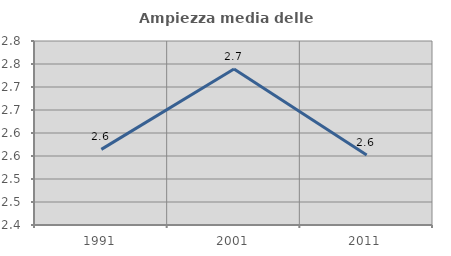
| Category | Ampiezza media delle famiglie |
|---|---|
| 1991.0 | 2.564 |
| 2001.0 | 2.739 |
| 2011.0 | 2.552 |